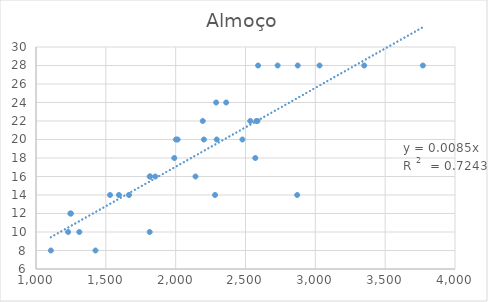
| Category | Almoço |
|---|---|
| 2202.0 | 20 |
| 1310.0 | 10 |
| 2194.0 | 22 |
| 1106.0 | 8 |
| 1814.0 | 16 |
| 2002.0 | 20 |
| 2362.0 | 24 |
| 1230.0 | 10 |
| 2586.0 | 22 |
| 1854.0 | 16 |
| 2534.0 | 22 |
| 2570.0 | 18 |
| 1246.0 | 12 |
| 1990.0 | 18 |
| 1594.0 | 14 |
| 2578.0 | 22 |
| 1530.0 | 14 |
| 2478.0 | 20 |
| 1666.0 | 14 |
| 2282.0 | 14 |
| 2142.0 | 16 |
| 3030.0 | 28 |
| 2590.0 | 28 |
| 2874.0 | 28 |
| 2014.0 | 20 |
| 3350.0 | 28 |
| 1250.0 | 12 |
| 2870.0 | 14 |
| 1814.0 | 10 |
| 3770.0 | 28 |
| 2294.0 | 20 |
| 2730.0 | 28 |
| 2290.0 | 24 |
| 1818.0 | 16 |
| 1426.0 | 8 |